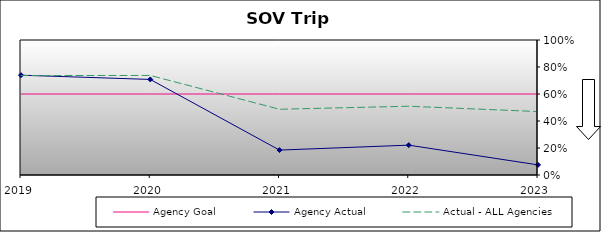
| Category | Agency Goal | Agency Actual | Actual - ALL Agencies |
|---|---|---|---|
| 2019.0 | 0.6 | 0.739 | 0.736 |
| 2020.0 | 0.6 | 0.708 | 0.737 |
| 2021.0 | 0.6 | 0.185 | 0.487 |
| 2022.0 | 0.6 | 0.221 | 0.509 |
| 2023.0 | 0.6 | 0.075 | 0.47 |